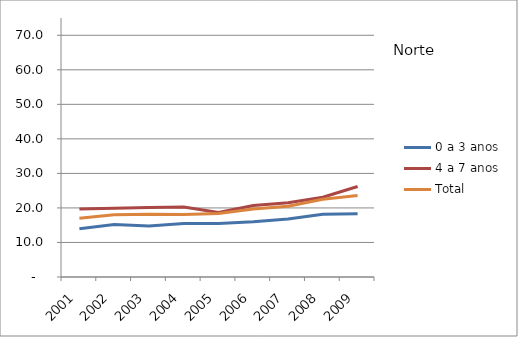
| Category | 0 a 3 anos | 4 a 7 anos | Total |
|---|---|---|---|
| 2001.0 | 14 | 19.7 | 17 |
| 2002.0 | 15.2 | 19.9 | 18 |
| 2003.0 | 14.8 | 20.1 | 18.2 |
| 2004.0 | 15.5 | 20.3 | 18.1 |
| 2005.0 | 15.5 | 18.7 | 18.4 |
| 2006.0 | 16 | 20.7 | 19.7 |
| 2007.0 | 16.8 | 21.5 | 20.5 |
| 2008.0 | 18.2 | 23.1 | 22.5 |
| 2009.0 | 18.3 | 26.2 | 23.6 |